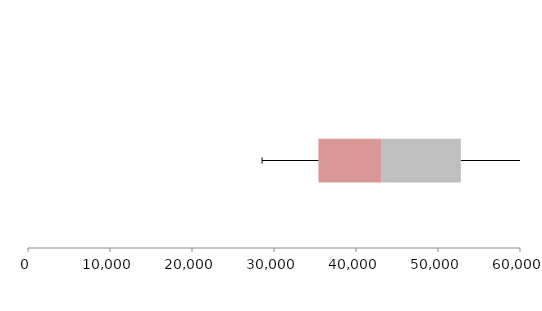
| Category | Series 1 | Series 2 | Series 3 |
|---|---|---|---|
| 0 | 35419.228 | 7717.113 | 9653.035 |